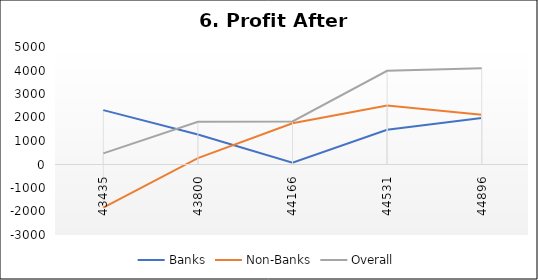
| Category | Banks | Non-Banks | Overall |
|---|---|---|---|
| 43435.0 | 2314.648 | -1839.873 | 474.78 |
| 43800.0 | 1276.592 | 270.579 | 1817.749 |
| 44166.0 | 80.106 | 1752.433 | 1832.539 |
| 44531.0 | 1479.639 | 2508.404 | 3988.043 |
| 44896.0 | 1976.641 | 2114.935 | 4091.576 |